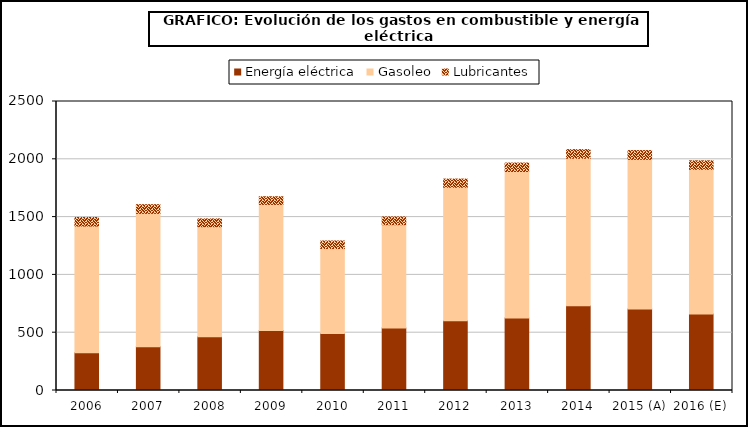
| Category | Energía eléctrica | Gasoleo | Lubricantes |
|---|---|---|---|
| 2006 | 325.85 | 1096.919 | 74.037 |
| 2007 | 379.292 | 1152.791 | 75.344 |
| 2008 | 465.509 | 951.283 | 67.537 |
| 2009 | 519.861 | 1089.777 | 66.177 |
| 2010 | 492.737 | 735.254 | 65.464 |
| 2011 | 541.39 | 892.822 | 66.957 |
| 2012 | 602.887 | 1155.464 | 70.222 |
| 2013 | 628.022 | 1266.655 | 72.753 |
| 2014 | 733.314 | 1275.795 | 74.642 |
| 2015 (A) | 705.431 | 1294.199 | 75.719 |
| 2016 (E) | 662.789 | 1250.744 | 73.177 |